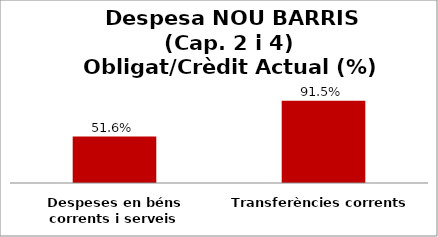
| Category | Series 0 |
|---|---|
| Despeses en béns corrents i serveis | 0.516 |
| Transferències corrents | 0.915 |